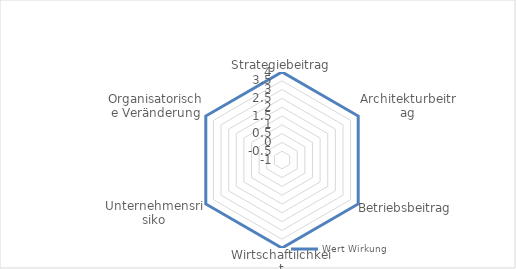
| Category | Wert Wirkung |
|---|---|
| Strategiebeitrag | 4 |
| Architekturbeitrag | 4 |
| Betriebsbeitrag | 4 |
| Wirtschaftilchkeit | 4 |
| Unternehmensrisiko | 4 |
| Organisatorische Veränderung | 4 |